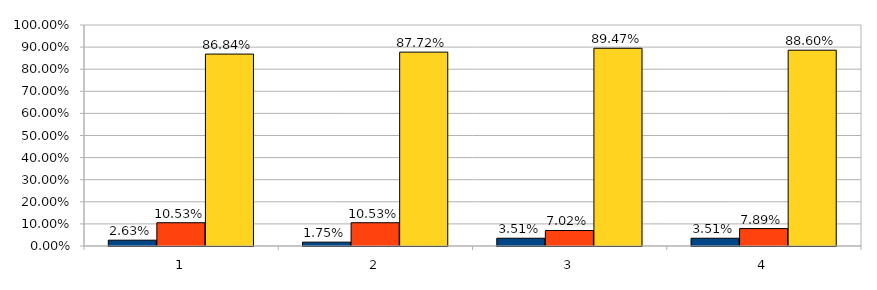
| Category | Series 0 | Series 1 | Series 2 |
|---|---|---|---|
| 0 | 0.026 | 0.105 | 0.868 |
| 1 | 0.018 | 0.105 | 0.877 |
| 2 | 0.035 | 0.07 | 0.895 |
| 3 | 0.035 | 0.079 | 0.886 |